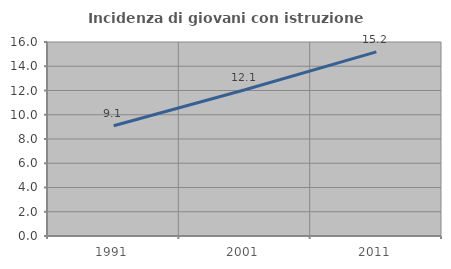
| Category | Incidenza di giovani con istruzione universitaria |
|---|---|
| 1991.0 | 9.091 |
| 2001.0 | 12.057 |
| 2011.0 | 15.19 |